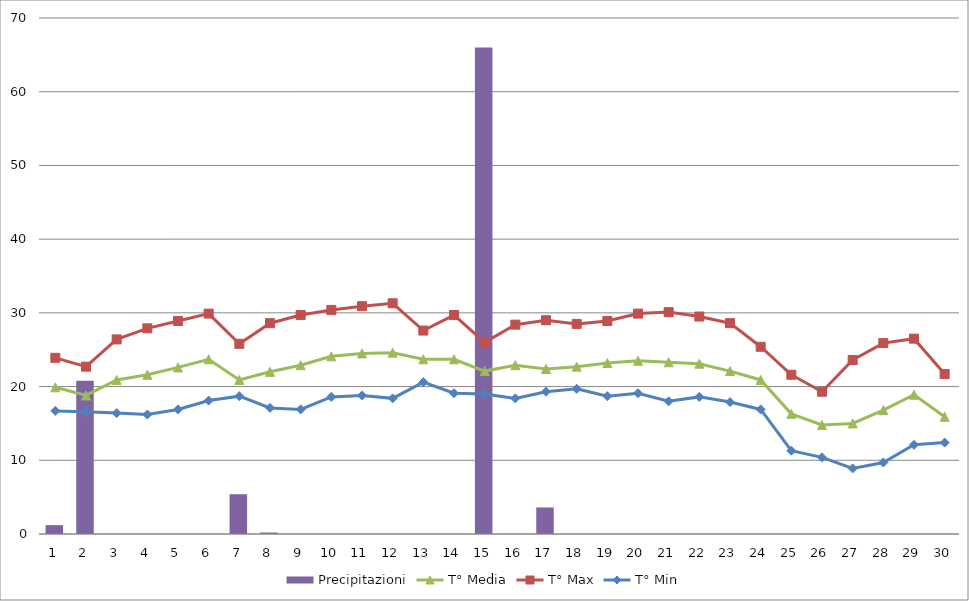
| Category | Precipitazioni |
|---|---|
| 0 | 1.2 |
| 1 | 20.8 |
| 2 | 0 |
| 3 | 0 |
| 4 | 0 |
| 5 | 0 |
| 6 | 5.4 |
| 7 | 0.2 |
| 8 | 0 |
| 9 | 0 |
| 10 | 0 |
| 11 | 0 |
| 12 | 0 |
| 13 | 0 |
| 14 | 66 |
| 15 | 0 |
| 16 | 3.6 |
| 17 | 0 |
| 18 | 0 |
| 19 | 0 |
| 20 | 0 |
| 21 | 0 |
| 22 | 0 |
| 23 | 0 |
| 24 | 0 |
| 25 | 0 |
| 26 | 0 |
| 27 | 0 |
| 28 | 0 |
| 29 | 0 |